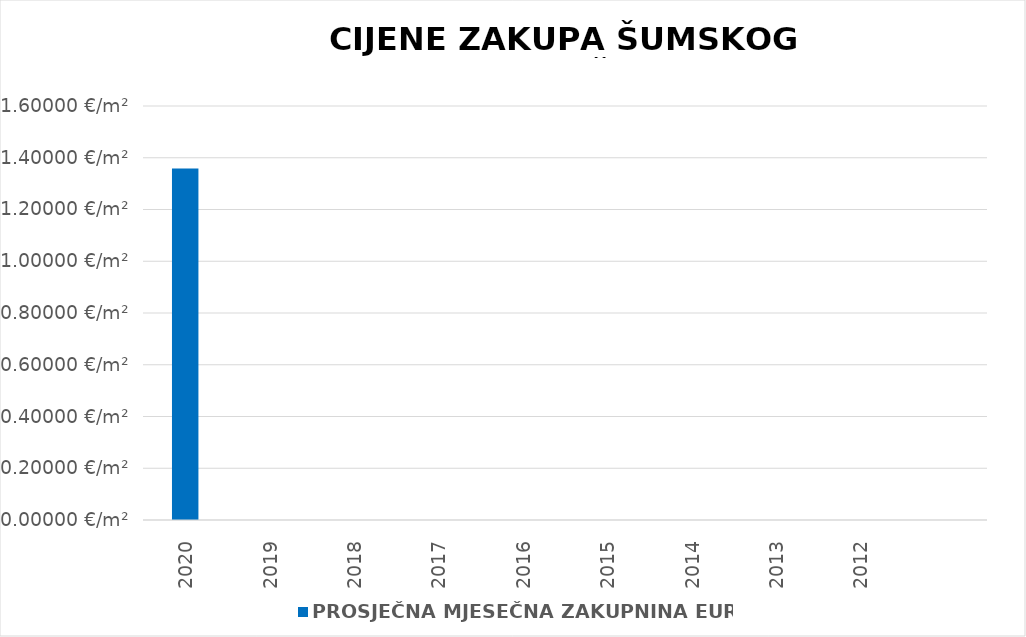
| Category | PROSJEČNA MJESEČNA ZAKUPNINA EUR/m2 |
|---|---|
| 2020 | 1900-01-01 08:35:37 |
| 2019 | 0 |
| 2018 | 0 |
| 2017 | 0 |
| 2016 | 0 |
| 2015 | 0 |
| 2014 | 0 |
| 2013 | 0 |
| 2012 | 0 |